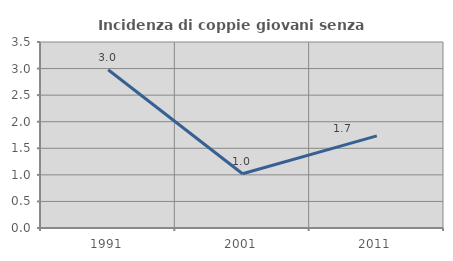
| Category | Incidenza di coppie giovani senza figli |
|---|---|
| 1991.0 | 2.979 |
| 2001.0 | 1.02 |
| 2011.0 | 1.734 |